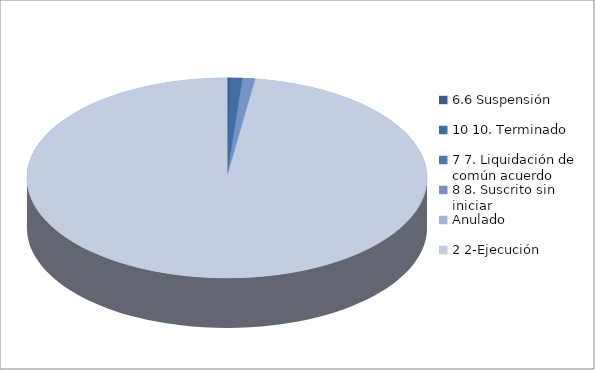
| Category | Series 0 |
|---|---|
| 6.6 Suspensión | 1 |
| 10 10. Terminado | 5 |
| 7 7. Liquidación de común acuerdo | 0 |
| 8 8. Suscrito sin iniciar | 5 |
| Anulado | 0 |
| 2 2-Ejecución | 472 |